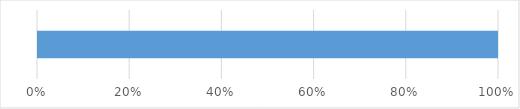
| Category | Series 0 | Series 1 | Series 2 | Series 3 | Series 4 |
|---|---|---|---|---|---|
| 0 | 0 | 0 | 0 | 0 | 19 |